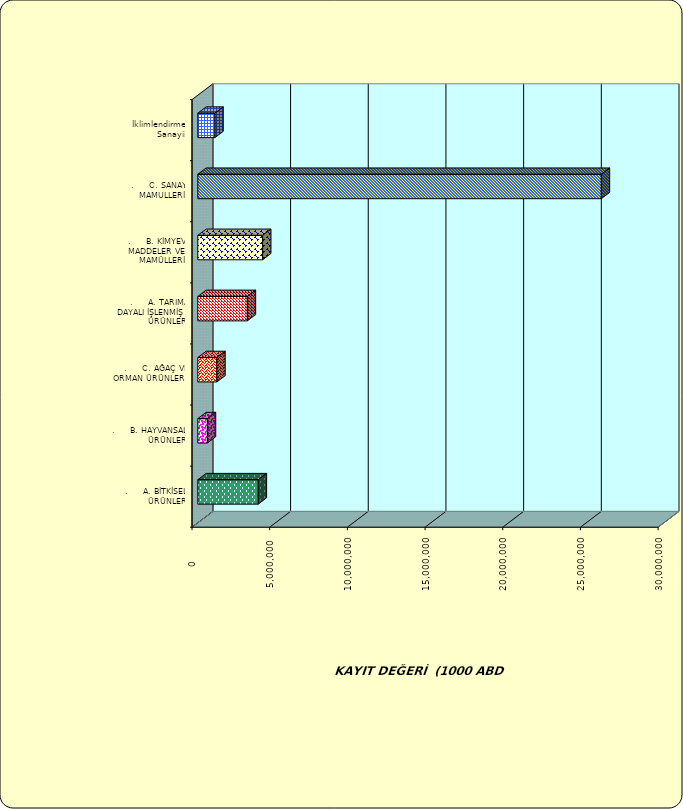
| Category | Series 0 |
|---|---|
| .     A. BİTKİSEL ÜRÜNLER | 3890494.511 |
| .     B. HAYVANSAL ÜRÜNLER | 615519.022 |
| .     C. AĞAÇ VE ORMAN ÜRÜNLERİ | 1226042.044 |
| .     A. TARIMA DAYALI İŞLENMİŞ ÜRÜNLER | 3185497.915 |
| .     B. KİMYEVİ MADDELER VE MAMÜLLERİ | 4170483.638 |
| .     C. SANAYİ MAMULLERİ | 25970910.936 |
|  İklimlendirme Sanayii | 1101007.761 |